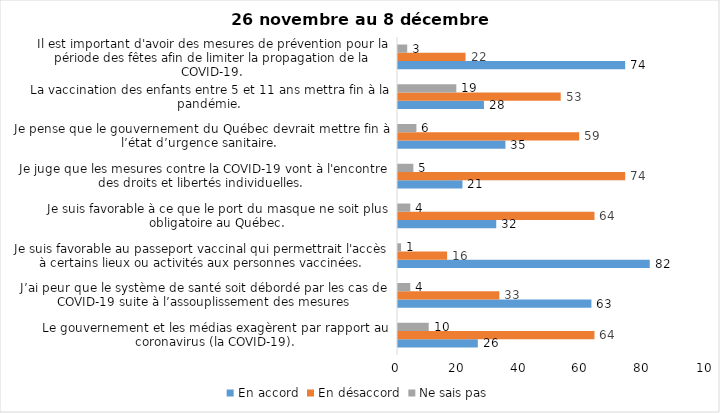
| Category | En accord | En désaccord | Ne sais pas |
|---|---|---|---|
| Le gouvernement et les médias exagèrent par rapport au coronavirus (la COVID-19). | 26 | 64 | 10 |
| J’ai peur que le système de santé soit débordé par les cas de COVID-19 suite à l’assouplissement des mesures | 63 | 33 | 4 |
| Je suis favorable au passeport vaccinal qui permettrait l'accès à certains lieux ou activités aux personnes vaccinées. | 82 | 16 | 1 |
| Je suis favorable à ce que le port du masque ne soit plus obligatoire au Québec. | 32 | 64 | 4 |
| Je juge que les mesures contre la COVID-19 vont à l'encontre des droits et libertés individuelles.  | 21 | 74 | 5 |
| Je pense que le gouvernement du Québec devrait mettre fin à l’état d’urgence sanitaire.  | 35 | 59 | 6 |
| La vaccination des enfants entre 5 et 11 ans mettra fin à la pandémie. | 28 | 53 | 19 |
| Il est important d'avoir des mesures de prévention pour la période des fêtes afin de limiter la propagation de la COVID-19. | 74 | 22 | 3 |